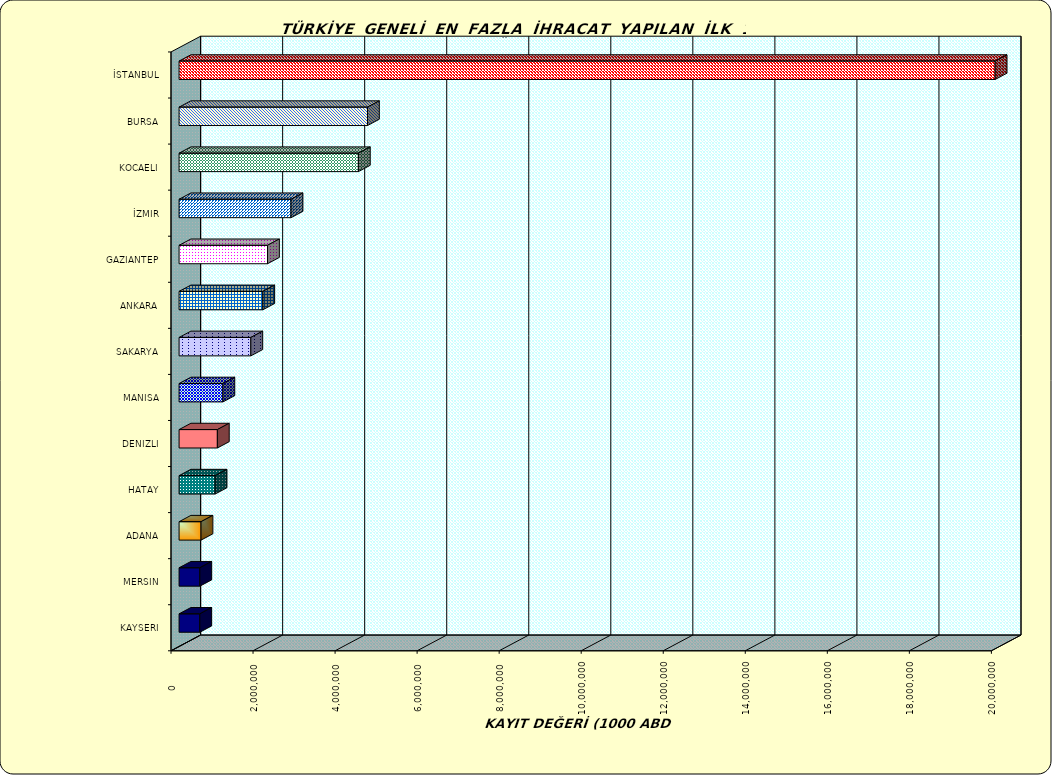
| Category | Series 0 |
|---|---|
| İSTANBUL | 19895210.226 |
| BURSA | 4593134.718 |
| KOCAELI | 4371215.386 |
| İZMIR | 2729968.658 |
| GAZIANTEP | 2156125.976 |
| ANKARA | 2040930.797 |
| SAKARYA | 1749514.081 |
| MANISA | 1068219.791 |
| DENIZLI | 933511.104 |
| HATAY | 878156.409 |
| ADANA | 534997.443 |
| MERSIN | 505919.978 |
| KAYSERI | 505201.107 |